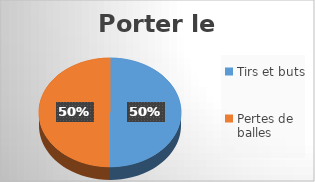
| Category | Series 0 |
|---|---|
| Tirs et buts | 50 |
| Pertes de balles | 50 |